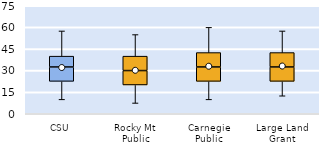
| Category | 25th | 50th | 75th |
|---|---|---|---|
| CSU | 22.5 | 10 | 7.5 |
| Rocky Mt Public | 20 | 10 | 10 |
| Carnegie Public | 22.5 | 10 | 10 |
| Large Land Grant | 22.5 | 10 | 10 |